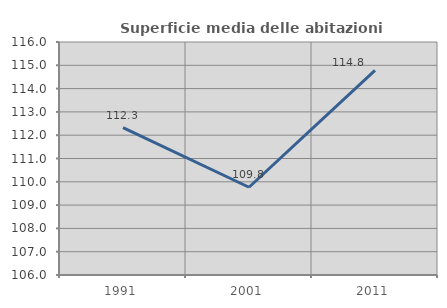
| Category | Superficie media delle abitazioni occupate |
|---|---|
| 1991.0 | 112.321 |
| 2001.0 | 109.767 |
| 2011.0 | 114.781 |